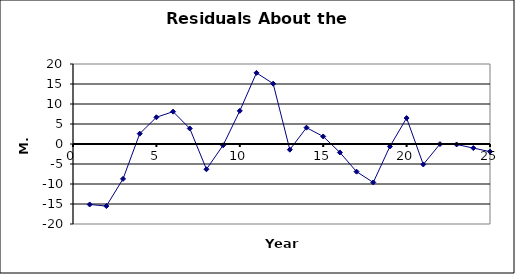
| Category | Series 0 |
|---|---|
| 1.0 | -15.116 |
| 2.0 | -15.516 |
| 3.0 | -8.716 |
| 4.0 | 2.584 |
| 5.0 | 6.684 |
| 6.0 | 8.084 |
| 7.0 | 3.884 |
| 8.0 | -6.316 |
| 9.0 | -0.316 |
| 10.0 | 8.284 |
| 11.0 | 17.784 |
| 12.0 | 15.084 |
| 13.0 | -1.416 |
| 14.0 | 4.084 |
| 15.0 | 1.884 |
| 16.0 | -2.116 |
| 17.0 | -6.916 |
| 18.0 | -9.616 |
| 19.0 | -0.616 |
| 20.0 | 6.484 |
| 21.0 | -5.116 |
| 22.0 | -0.016 |
| 23.0 | -0.116 |
| 24.0 | -1.016 |
| 25.0 | -1.916 |